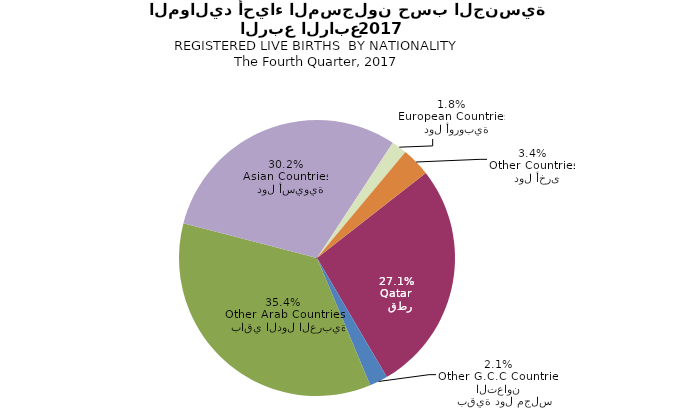
| Category | Series 0 |
|---|---|
|   قطر
Qatar | 1912 |
|   بقية دول مجلس التعاون
Other G.C.C Countries | 151 |
|   باقي الدول العربية
Other Arab Countries | 2493 |
|   دول أسيوية
Asian Countries | 2130 |
|   دول أوروبية
European Countries | 128 |
|   دول أخرى
Other Countries | 238 |